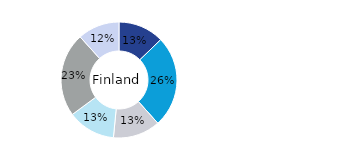
| Category | Finland |
|---|---|
| Kontor | 0.128 |
| Bostäder | 0.256 |
| Handel | 0.132 |
| Logistik* | 0.133 |
| Samhällsfastigheter** | 0.234 |
| Övrigt | 0.117 |